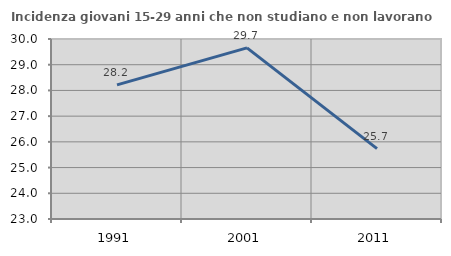
| Category | Incidenza giovani 15-29 anni che non studiano e non lavorano  |
|---|---|
| 1991.0 | 28.217 |
| 2001.0 | 29.653 |
| 2011.0 | 25.736 |